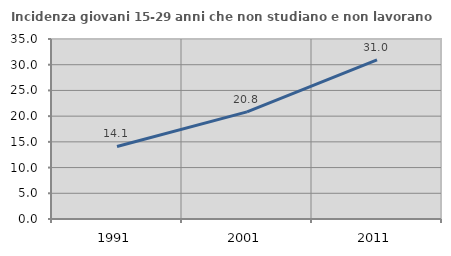
| Category | Incidenza giovani 15-29 anni che non studiano e non lavorano  |
|---|---|
| 1991.0 | 14.1 |
| 2001.0 | 20.833 |
| 2011.0 | 30.952 |